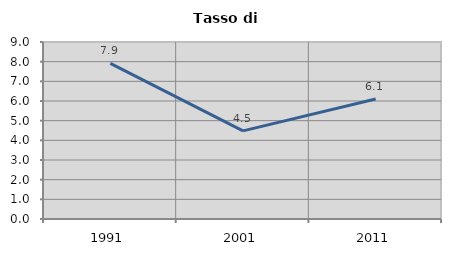
| Category | Tasso di disoccupazione   |
|---|---|
| 1991.0 | 7.917 |
| 2001.0 | 4.48 |
| 2011.0 | 6.098 |